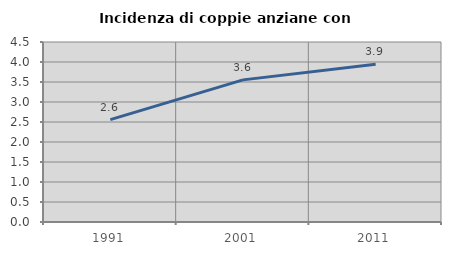
| Category | Incidenza di coppie anziane con figli |
|---|---|
| 1991.0 | 2.56 |
| 2001.0 | 3.553 |
| 2011.0 | 3.943 |